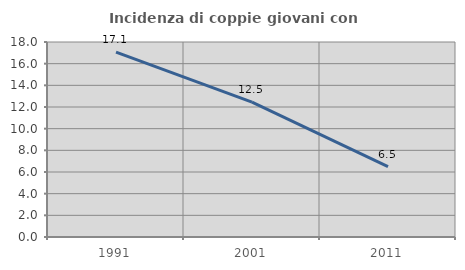
| Category | Incidenza di coppie giovani con figli |
|---|---|
| 1991.0 | 17.065 |
| 2001.0 | 12.453 |
| 2011.0 | 6.505 |